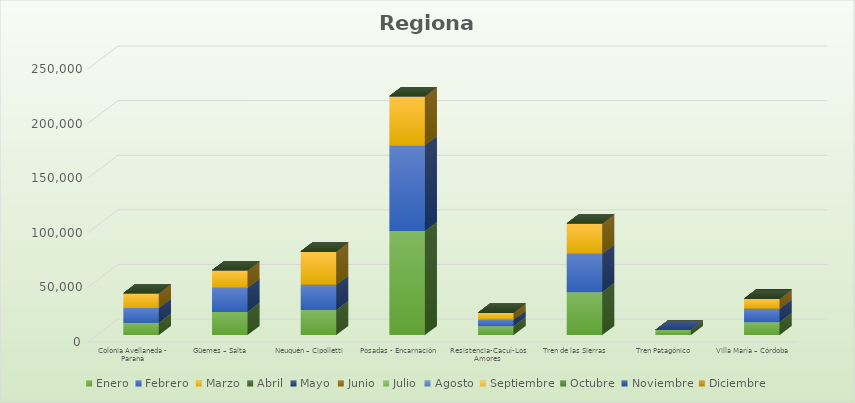
| Category | Enero | Febrero | Marzo | Abril | Mayo | Junio | Julio | Agosto | Septiembre | Octubre | Noviembre | Diciembre |
|---|---|---|---|---|---|---|---|---|---|---|---|---|
| Colonia Avellaneda - Paraná | 11275 | 13643 | 13526 | 0 | 0 | 0 | 0 | 0 | 0 | 0 | 0 | 0 |
| Güemes – Salta | 21247 | 22210 | 15827 | 0 | 0 | 0 | 0 | 0 | 0 | 0 | 0 | 0 |
| Neuquén – Cipolletti | 22938 | 23210 | 30369 | 0 | 0 | 0 | 0 | 0 | 0 | 0 | 0 | 0 |
| Posadas - Encarnación | 95271 | 78610 | 44928 | 0 | 0 | 0 | 0 | 0 | 0 | 0 | 0 | 0 |
| Resistencia-Cacuí-Los Amores | 8086 | 6004 | 6460 | 0 | 0 | 0 | 0 | 0 | 0 | 0 | 0 | 0 |
| Tren de las Sierras | 39223 | 35332 | 27667 | 0 | 0 | 0 | 0 | 0 | 0 | 0 | 0 | 0 |
| Tren Patagónico | 4680 | 0 | 0 | 0 | 0 | 0 | 0 | 0 | 0 | 0 | 0 | 0 |
| Villa María – Córdoba | 11841 | 12312 | 9131 | 0 | 0 | 0 | 0 | 0 | 0 | 0 | 0 | 0 |